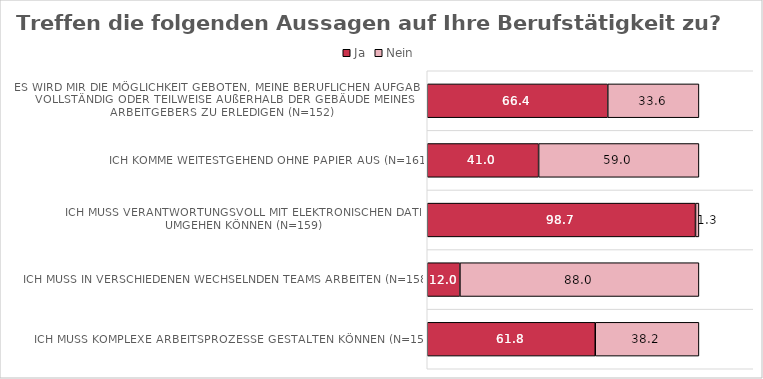
| Category | Ja | Nein |
|---|---|---|
| Es wird mir die Möglichkeit geboten, meine beruflichen Aufgaben vollständig oder teilweise außerhalb der Gebäude meines Arbeitgebers zu erledigen (n=152) | 66.447 | 33.553 |
| Ich komme weitestgehend ohne Papier aus (n=161) | 40.994 | 59.006 |
| Ich muss verantwortungsvoll mit elektronischen Daten umgehen können (n=159) | 98.742 | 1.258 |
| Ich muss in verschiedenen wechselnden Teams arbeiten (n=158) | 12.025 | 87.975 |
| Ich muss komplexe Arbeitsprozesse gestalten können (n=152) | 61.842 | 38.158 |